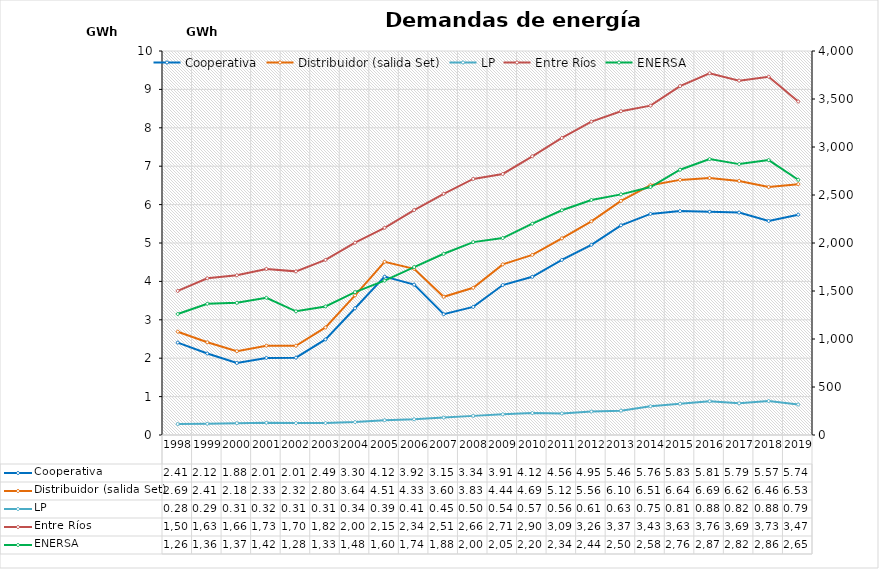
| Category | Cooperativa | Distribuidor (salida Set) | LP |
|---|---|---|---|
| 1998.0 | 2.406 | 2.69 | 0.284 |
| 1999.0 | 2.123 | 2.414 | 0.291 |
| 2000.0 | 1.876 | 2.183 | 0.307 |
| 2001.0 | 2.008 | 2.326 | 0.318 |
| 2002.0 | 2.015 | 2.324 | 0.31 |
| 2003.0 | 2.489 | 2.8 | 0.312 |
| 2004.0 | 3.3 | 3.636 | 0.336 |
| 2005.0 | 4.124 | 4.509 | 0.386 |
| 2006.0 | 3.916 | 4.327 | 0.411 |
| 2007.0 | 3.145 | 3.599 | 0.453 |
| 2008.0 | 3.336 | 3.834 | 0.498 |
| 2009.0 | 3.905 | 4.444 | 0.539 |
| 2010.0 | 4.119 | 4.69 | 0.571 |
| 2011.0 | 4.56 | 5.121 | 0.561 |
| 2012.0 | 4.954 | 5.564 | 0.61 |
| 2013.0 | 5.461 | 6.095 | 0.635 |
| 2014.0 | 5.757 | 6.507 | 0.749 |
| 2015.0 | 5.832 | 6.644 | 0.812 |
| 2016.0 | 5.814 | 6.692 | 0.879 |
| 2017.0 | 5.792 | 6.616 | 0.824 |
| 2018.0 | 5.573 | 6.458 | 0.885 |
| 2019.0 | 5.738 | 6.533 | 0.795 |